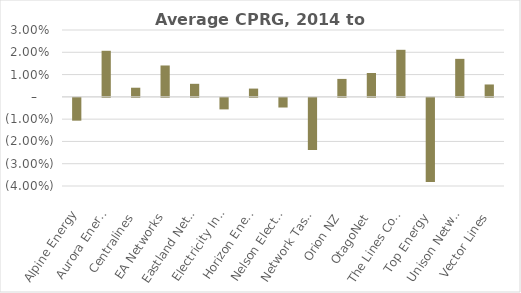
| Category | Series 0 |
|---|---|
| Alpine Energy | -0.01 |
| Aurora Energy | 0.021 |
| Centralines | 0.004 |
| EA Networks | 0.014 |
| Eastland Network | 0.006 |
| Electricity Invercargill | -0.005 |
| Horizon Energy | 0.004 |
| Nelson Electricity | -0.004 |
| Network Tasman | -0.023 |
| Orion NZ | 0.008 |
| OtagoNet | 0.011 |
| The Lines Company | 0.021 |
| Top Energy | -0.038 |
| Unison Networks | 0.017 |
| Vector Lines | 0.006 |